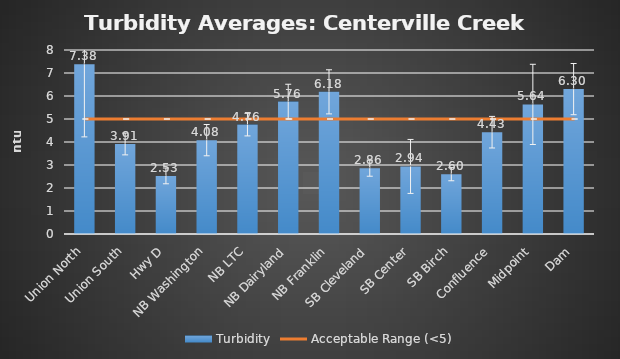
| Category | Turbidity |
|---|---|
| Union North | 7.383 |
| Union South | 3.915 |
| Hwy D | 2.526 |
| NB Washington | 4.08 |
| NB LTC | 4.756 |
| NB Dairyland | 5.756 |
| NB Franklin | 6.18 |
| SB Cleveland | 2.862 |
| SB Center | 2.938 |
| SB Birch | 2.6 |
| Confluence | 4.427 |
| Midpoint | 5.635 |
| Dam | 6.3 |